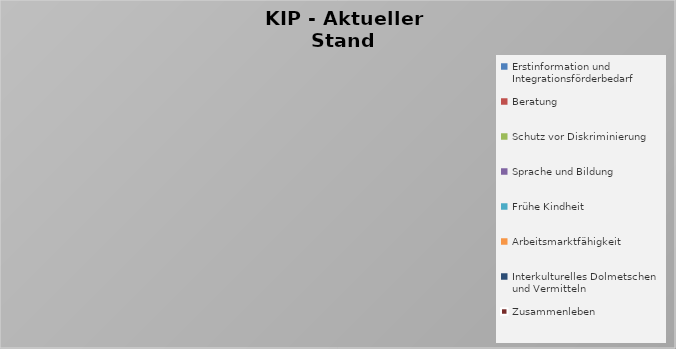
| Category | Total |
|---|---|
| Erstinformation und Integrationsförderbedarf | 0 |
| Beratung | 0 |
| Schutz vor Diskriminierung | 0 |
| Sprache und Bildung | 0 |
| Frühe Kindheit | 0 |
| Arbeitsmarktfähigkeit | 0 |
| Interkulturelles Dolmetschen und Vermitteln | 0 |
| Zusammenleben | 0 |